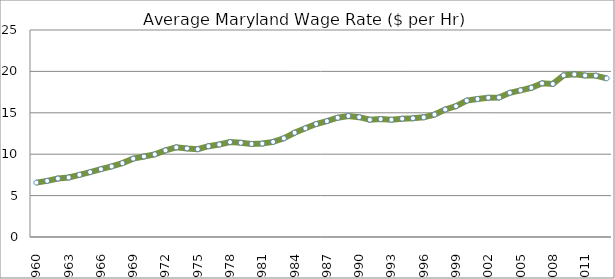
| Category | Series 0 |
|---|---|
| 1960.0 | 6.57 |
| 1961.0 | 6.775 |
| 1962.0 | 7.059 |
| 1963.0 | 7.189 |
| 1964.0 | 7.512 |
| 1965.0 | 7.832 |
| 1966.0 | 8.189 |
| 1967.0 | 8.519 |
| 1968.0 | 8.921 |
| 1969.0 | 9.465 |
| 1970.0 | 9.726 |
| 1971.0 | 9.982 |
| 1972.0 | 10.461 |
| 1973.0 | 10.828 |
| 1974.0 | 10.697 |
| 1975.0 | 10.607 |
| 1976.0 | 10.966 |
| 1977.0 | 11.174 |
| 1978.0 | 11.465 |
| 1979.0 | 11.377 |
| 1980.0 | 11.24 |
| 1981.0 | 11.283 |
| 1982.0 | 11.484 |
| 1983.0 | 11.917 |
| 1984.0 | 12.592 |
| 1985.0 | 13.133 |
| 1986.0 | 13.648 |
| 1987.0 | 13.998 |
| 1988.0 | 14.404 |
| 1989.0 | 14.622 |
| 1990.0 | 14.475 |
| 1991.0 | 14.165 |
| 1992.0 | 14.244 |
| 1993.0 | 14.163 |
| 1994.0 | 14.294 |
| 1995.0 | 14.338 |
| 1996.0 | 14.454 |
| 1997.0 | 14.786 |
| 1998.0 | 15.398 |
| 1999.0 | 15.8 |
| 2000.0 | 16.473 |
| 2001.0 | 16.667 |
| 2002.0 | 16.821 |
| 2003.0 | 16.846 |
| 2004.0 | 17.417 |
| 2005.0 | 17.711 |
| 2006.0 | 18.023 |
| 2007.0 | 18.559 |
| 2008.0 | 18.492 |
| 2009.0 | 19.52 |
| 2010.0 | 19.645 |
| 2011.0 | 19.506 |
| 2012.0 | 19.49 |
| 2013.0 | 19.162 |